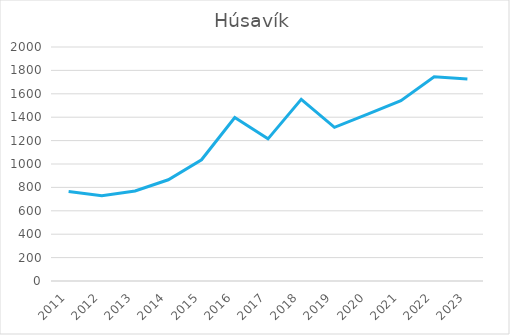
| Category | Húsavík |
|---|---|
| 2011 | 765 |
| 2012 | 729 |
| 2013 | 769 |
| 2014 | 865 |
| 2015 | 1036 |
| 2016 | 1397 |
| 2017 | 1215 |
| 2018 | 1553 |
| 2019 | 1313 |
| 2020 | 1427 |
| 2021 | 1541 |
| 2022 | 1745 |
| 2023 | 1727 |